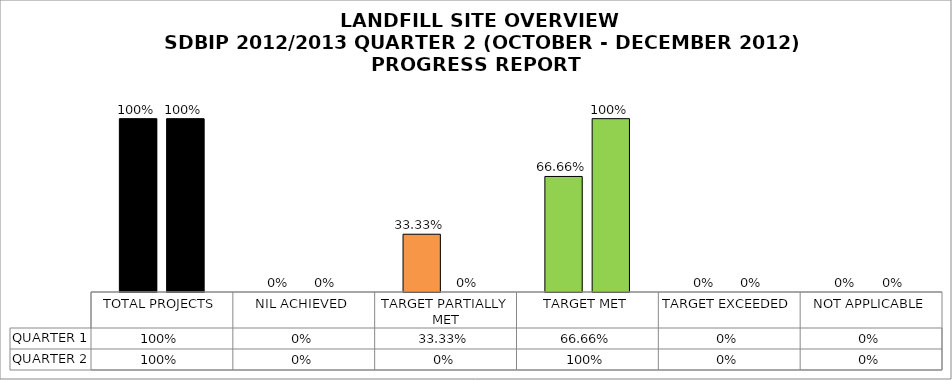
| Category | QUARTER 1 | QUARTER 2 |
|---|---|---|
| TOTAL PROJECTS | 1 | 1 |
| NIL ACHIEVED | 0 | 0 |
| TARGET PARTIALLY MET | 0.333 | 0 |
| TARGET MET | 0.667 | 1 |
| TARGET EXCEEDED | 0 | 0 |
| NOT APPLICABLE | 0 | 0 |